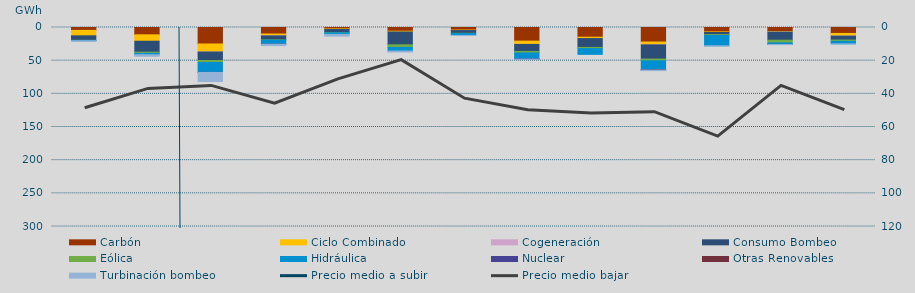
| Category | Carbón | Ciclo Combinado | Cogeneración | Consumo Bombeo | Eólica | Hidráulica | Nuclear | Otras Renovables | Turbinación bombeo |
|---|---|---|---|---|---|---|---|---|---|
| 0 | 4345.4 | 8205.3 | 0 | 6736.7 | 204.5 | 506 | 0 | 0 | 802.1 |
| 1 | 11031.5 | 9660.7 | 0 | 16502.5 | 1775.9 | 2151.2 | 0 | 0 | 2234.6 |
| 2 | 24843.5 | 12025 | 139.2 | 12696.1 | 3036.8 | 14862.1 | 109.8 | 0 | 13649 |
| 3 | 9788.3 | 2896.9 | 13 | 5978.6 | 470.2 | 6144.5 | 0 | 2 | 2006.5 |
| 4 | 1915.7 | 883.7 | 0 | 4789.3 | 395.2 | 2417.8 | 0 | 0 | 2598.3 |
| 5 | 5601.6 | 1130.8 | 0 | 19369.2 | 3910.4 | 5534.9 | 0 | 0 | 1362.4 |
| 6 | 3825.2 | 805.7 | 1 | 4108.2 | 441.1 | 2792 | 0 | 0 | 67.3 |
| 7 | 20542.2 | 4950.3 | 40.5 | 10583.3 | 2263.7 | 9147 | 197.5 | 0 | 285 |
| 8 | 14664.7 | 1989 | 0 | 13423.2 | 1723.5 | 8686.8 | 0 | 0 | 0 |
| 9 | 21887.7 | 4264.5 | 79.6 | 21354.7 | 2677.3 | 13814.3 | 70 | 3 | 823.8 |
| 10 | 6583.4 | 903.3 | 0 | 3217 | 1397.7 | 15518.8 | 0 | 0 | 135.7 |
| 11 | 6055 | 869.5 | 10.2 | 12220.9 | 4048.2 | 2358.3 | 0 | 9 | 300 |
| 12 | 8959.6 | 3990.4 | 71.2 | 5885.6 | 1996.4 | 3716.9 | 0 | 0 | 15 |